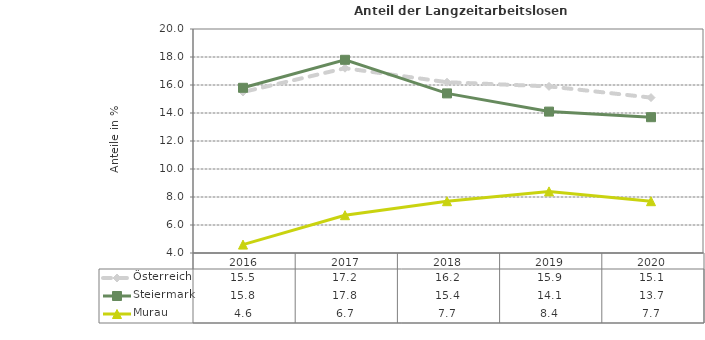
| Category | Österreich | Steiermark | Murau |
|---|---|---|---|
| 2020.0 | 15.1 | 13.7 | 7.7 |
| 2019.0 | 15.9 | 14.1 | 8.4 |
| 2018.0 | 16.2 | 15.4 | 7.7 |
| 2017.0 | 17.2 | 17.8 | 6.7 |
| 2016.0 | 15.5 | 15.8 | 4.6 |